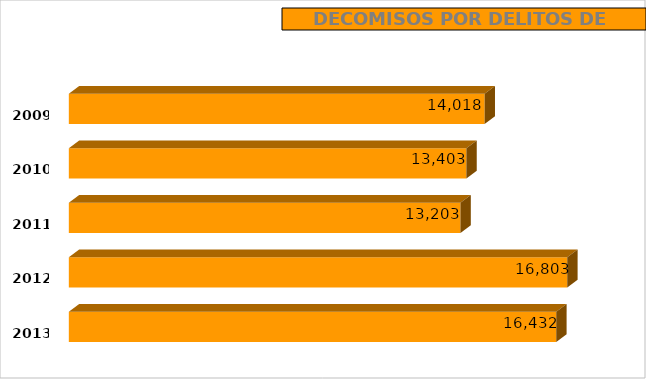
| Category | decomisos |
|---|---|
| 2009.0 | 14018 |
| 2010.0 | 13403 |
| 2011.0 | 13203 |
| 2012.0 | 16803 |
| 2013.0 | 16432 |